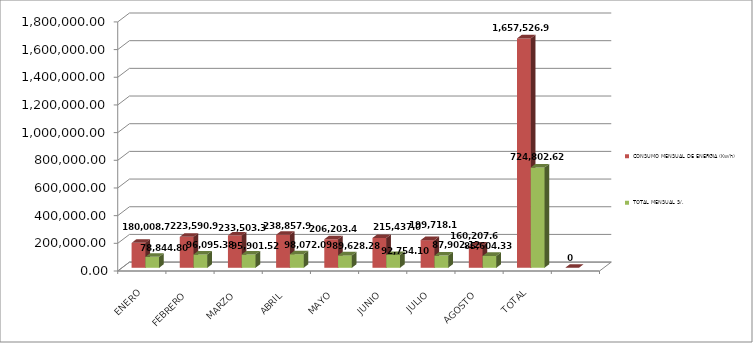
| Category | CONSUMO MENSUAL DE ENERGIA (Kw/h) | TOTAL MENSUAL S/. |
|---|---|---|
| ENERO | 180008.74 | 78844.8 |
| FEBRERO | 223590.9 | 96095.38 |
| MARZO | 233503.3 | 95901.52 |
| ABRIL | 238857.9 | 98072.09 |
| MAYO | 206203.4 | 89628.28 |
| JUNIO | 215437 | 92754.1 |
| JULIO | 199718.1 | 87902.12 |
| AGOSTO | 160207.6 | 85604.33 |
| TOTAL | 1657526.94 | 724802.62 |